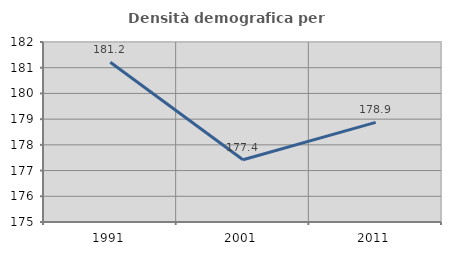
| Category | Densità demografica |
|---|---|
| 1991.0 | 181.215 |
| 2001.0 | 177.419 |
| 2011.0 | 178.873 |